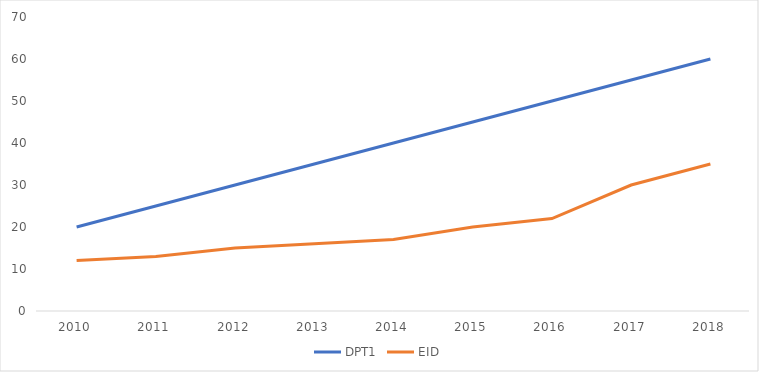
| Category | DPT1 | EID |
|---|---|---|
| 2010.0 | 20 | 12 |
| 2011.0 | 25 | 13 |
| 2012.0 | 30 | 15 |
| 2013.0 | 35 | 16 |
| 2014.0 | 40 | 17 |
| 2015.0 | 45 | 20 |
| 2016.0 | 50 | 22 |
| 2017.0 | 55 | 30 |
| 2018.0 | 60 | 35 |